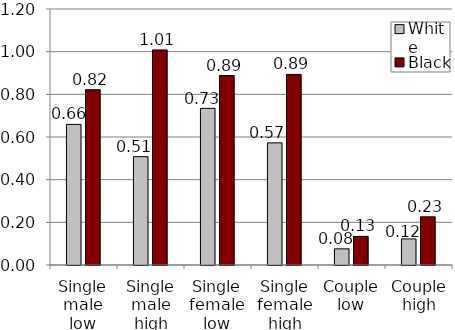
| Category | White | Black |
|---|---|---|
| Single male low | 0.659 | 0.822 |
| Single male high | 0.508 | 1.008 |
| Single female low | 0.734 | 0.888 |
| Single female high | 0.573 | 0.893 |
| Couple low | 0.076 | 0.134 |
| Couple high | 0.122 | 0.226 |